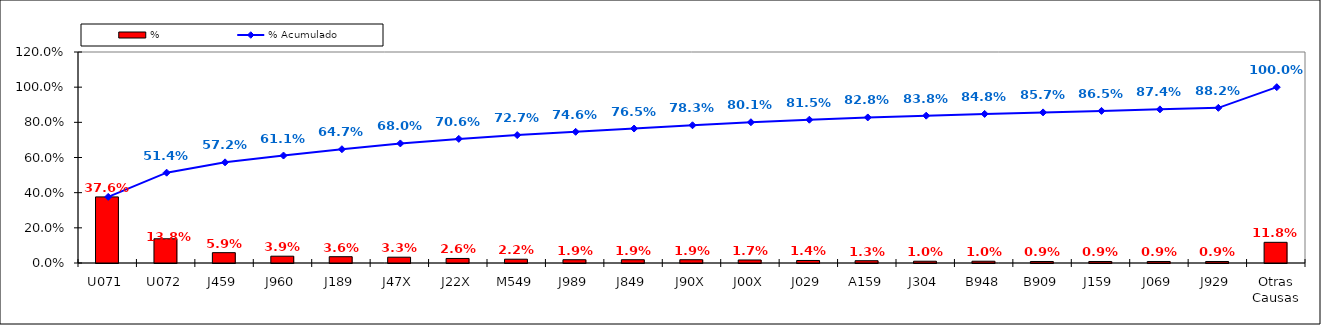
| Category | % |
|---|---|
| U071 | 0.376 |
| U072 | 0.138 |
| J459 | 0.059 |
| J960 | 0.039 |
| J189 | 0.036 |
| J47X | 0.033 |
| J22X | 0.026 |
| M549 | 0.022 |
| J989 | 0.019 |
| J849 | 0.019 |
| J90X | 0.019 |
| J00X | 0.017 |
| J029 | 0.014 |
| A159 | 0.013 |
| J304 | 0.01 |
| B948 | 0.01 |
| B909 | 0.009 |
| J159 | 0.009 |
| J069 | 0.009 |
| J929 | 0.009 |
| Otras Causas | 0.118 |